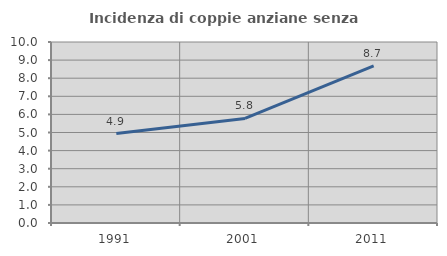
| Category | Incidenza di coppie anziane senza figli  |
|---|---|
| 1991.0 | 4.94 |
| 2001.0 | 5.777 |
| 2011.0 | 8.676 |